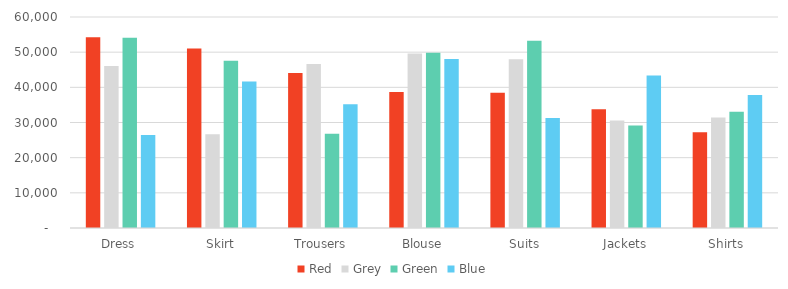
| Category | Red | Grey | Green | Blue |
|---|---|---|---|---|
| Dress | 54255 | 46075 | 54132 | 26453 |
| Skirt | 51076 | 26678 | 47562 | 41641 |
| Trousers | 44105 | 46632 | 26819 | 35172 |
| Blouse | 38707 | 49596 | 49827 | 48088 |
| Suits | 38454 | 47985 | 53243 | 31307 |
| Jackets | 33768 | 30571 | 29170 | 43364 |
| Shirts | 27216 | 31391 | 33040 | 37787 |